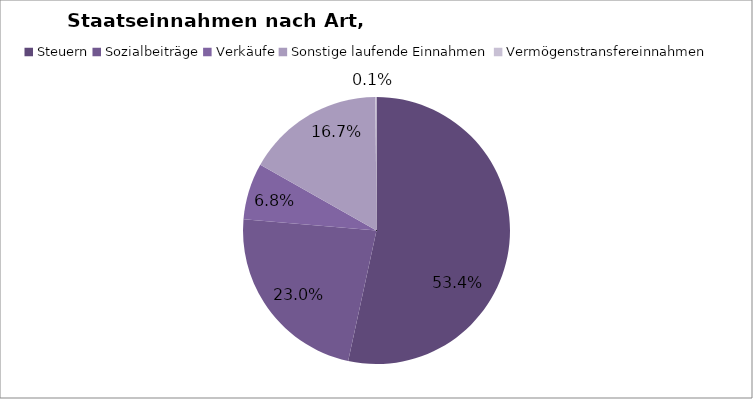
| Category | Series 0 |
|---|---|
| Steuern | 970.284 |
| Sozialbeiträge | 416.918 |
| Verkäufe | 124.279 |
| Sonstige laufende Einnahmen | 303.138 |
| Vermögenstransfereinnahmen | 2.21 |